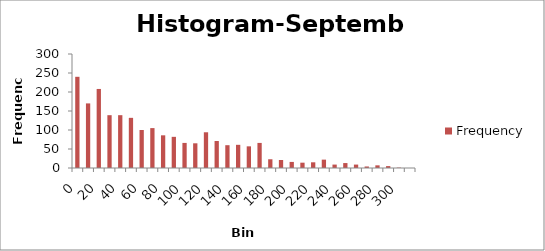
| Category | Frequency |
|---|---|
| 0 | 240 |
| 10 | 170 |
| 20 | 208 |
| 30 | 139 |
| 40 | 139 |
| 50 | 132 |
| 60 | 100 |
| 70 | 105 |
| 80 | 86 |
| 90 | 82 |
| 100 | 66 |
| 110 | 65 |
| 120 | 94 |
| 130 | 71 |
| 140 | 60 |
| 150 | 61 |
| 160 | 57 |
| 170 | 66 |
| 180 | 23 |
| 190 | 21 |
| 200 | 16 |
| 210 | 14 |
| 220 | 15 |
| 230 | 22 |
| 240 | 9 |
| 250 | 13 |
| 260 | 9 |
| 270 | 4 |
| 280 | 7 |
| 290 | 5 |
| 300 | 1 |
| More | 0 |